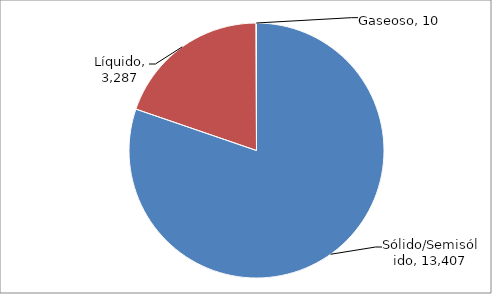
| Category | Series 0 |
|---|---|
| Sólido/Semisólido | 13406.508 |
| Líquido | 3287.145 |
| Gaseoso | 9.826 |